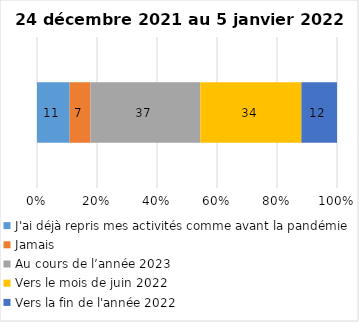
| Category | J'ai déjà repris mes activités comme avant la pandémie | Jamais | Au cours de l’année 2023 | Vers le mois de juin 2022 | Vers la fin de l'année 2022 |
|---|---|---|---|---|---|
| 0 | 11 | 7 | 37 | 34 | 12 |